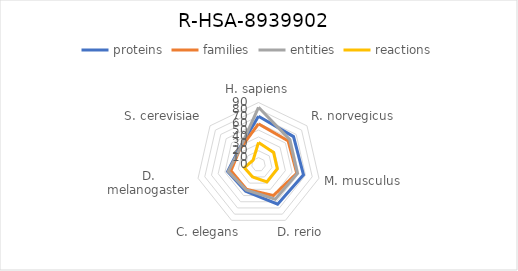
| Category | proteins | families | entities | reactions |
|---|---|---|---|---|
| H. sapiens | 70 | 59 | 83 | 32 |
| R. norvegicus | 65 | 55 | 58 | 28 |
| M. musculus | 67 | 57 | 58 | 28 |
| D. rerio | 64 | 50 | 56 | 28 |
| C. elegans | 43 | 40 | 41 | 20 |
| D. melanogaster | 46 | 41 | 45 | 21 |
| S. cerevisiae | 36 | 35 | 35 | 10 |